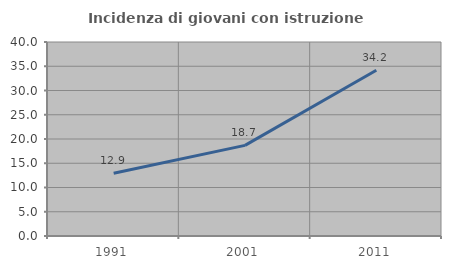
| Category | Incidenza di giovani con istruzione universitaria |
|---|---|
| 1991.0 | 12.925 |
| 2001.0 | 18.682 |
| 2011.0 | 34.189 |